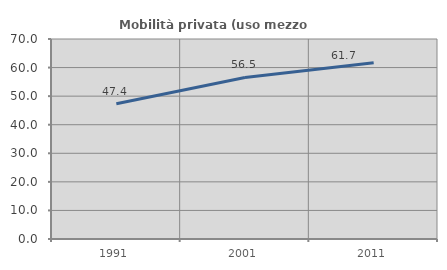
| Category | Mobilità privata (uso mezzo privato) |
|---|---|
| 1991.0 | 47.36 |
| 2001.0 | 56.527 |
| 2011.0 | 61.664 |